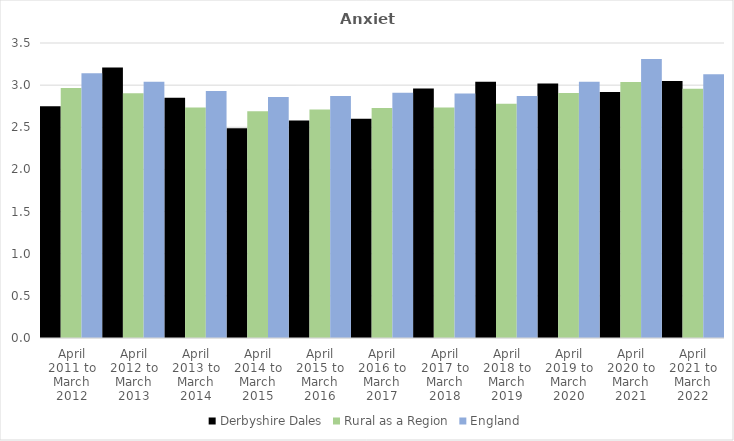
| Category | Derbyshire Dales | Rural as a Region | England |
|---|---|---|---|
| April 2011 to March 2012 | 2.75 | 2.967 | 3.14 |
| April 2012 to March 2013 | 3.21 | 2.904 | 3.04 |
| April 2013 to March 2014 | 2.85 | 2.734 | 2.93 |
| April 2014 to March 2015 | 2.49 | 2.691 | 2.86 |
| April 2015 to March 2016 | 2.58 | 2.711 | 2.87 |
| April 2016 to March 2017 | 2.6 | 2.729 | 2.91 |
| April 2017 to March 2018 | 2.96 | 2.736 | 2.9 |
| April 2018 to March 2019 | 3.04 | 2.78 | 2.87 |
| April 2019 to March 2020 | 3.02 | 2.908 | 3.04 |
| April 2020 to March 2021 | 2.92 | 3.036 | 3.31 |
| April 2021 to March 2022 | 3.05 | 2.956 | 3.13 |